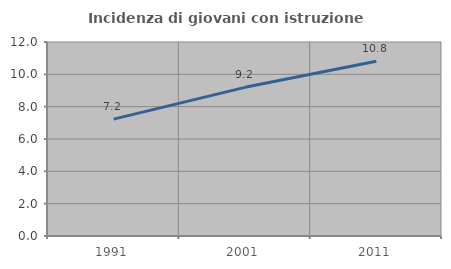
| Category | Incidenza di giovani con istruzione universitaria |
|---|---|
| 1991.0 | 7.229 |
| 2001.0 | 9.195 |
| 2011.0 | 10.811 |